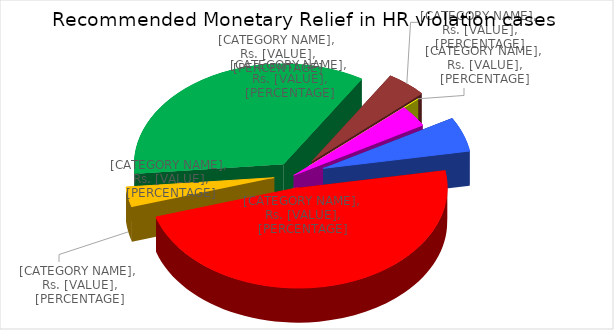
| Category | Recommended Monetary Relief (Rs.) |
|---|---|
| Arunachal Pradesh | 3600000 |
| Assam | 31090000 |
| Jammu and Kashmir | 2100000 |
| Manipur | 22860000 |
| Meghalaya | 2825000 |
| Nagaland | 0 |
| Tripura | 2245000 |